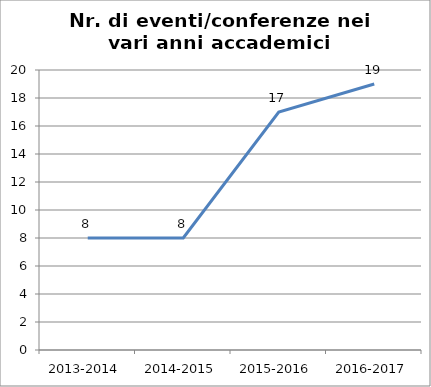
| Category | Nr. Eventi/Conferenze |
|---|---|
| 2013-2014 | 8 |
| 2014-2015 | 8 |
| 2015-2016 | 17 |
| 2016-2017 | 19 |